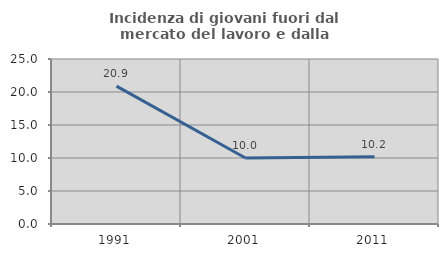
| Category | Incidenza di giovani fuori dal mercato del lavoro e dalla formazione  |
|---|---|
| 1991.0 | 20.886 |
| 2001.0 | 10 |
| 2011.0 | 10.204 |